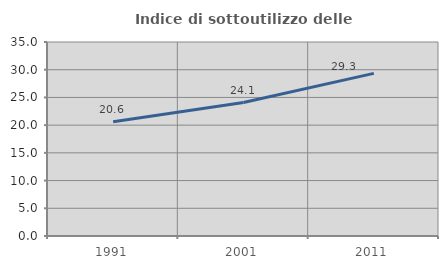
| Category | Indice di sottoutilizzo delle abitazioni  |
|---|---|
| 1991.0 | 20.596 |
| 2001.0 | 24.078 |
| 2011.0 | 29.344 |